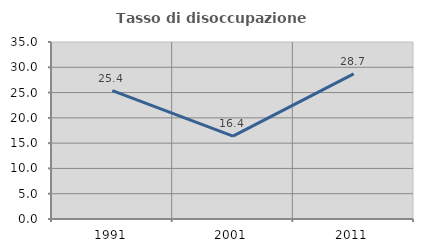
| Category | Tasso di disoccupazione giovanile  |
|---|---|
| 1991.0 | 25.397 |
| 2001.0 | 16.379 |
| 2011.0 | 28.713 |